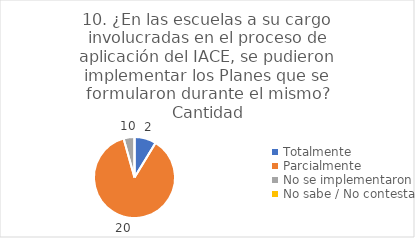
| Category | 10. ¿En las escuelas a su cargo involucradas en el proceso de aplicación del IACE, se pudieron implementar los Planes que se formularon durante el mismo? |
|---|---|
| Totalmente  | 0.087 |
| Parcialmente  | 0.87 |
| No se implementaron  | 0.043 |
| No sabe / No contesta | 0 |